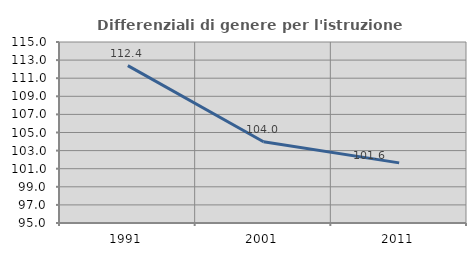
| Category | Differenziali di genere per l'istruzione superiore |
|---|---|
| 1991.0 | 112.386 |
| 2001.0 | 103.977 |
| 2011.0 | 101.645 |